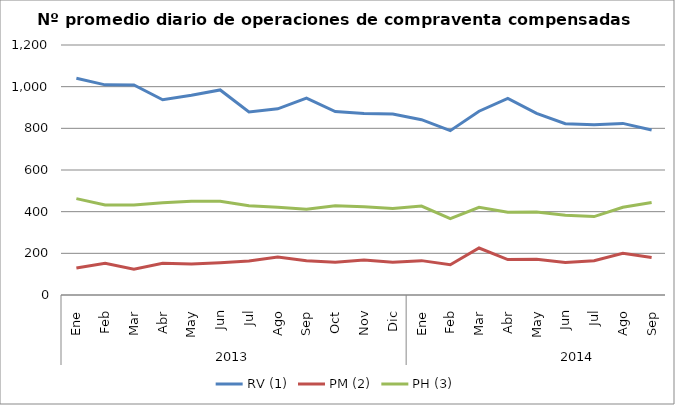
| Category | RV (1) | PM (2) | PH (3) |
|---|---|---|---|
| 0 | 1040.636 | 129.682 | 462.545 |
| 1 | 1008.7 | 152.35 | 432.05 |
| 2 | 1008.45 | 123.6 | 431.9 |
| 3 | 937.091 | 152.273 | 442.545 |
| 4 | 958.381 | 148.429 | 449.571 |
| 5 | 984.3 | 154.95 | 450 |
| 6 | 878.955 | 163.091 | 427.955 |
| 7 | 893.762 | 182.333 | 420.857 |
| 8 | 945.278 | 164.944 | 411.222 |
| 9 | 880.5 | 156.955 | 428.864 |
| 10 | 871.35 | 167.95 | 423.25 |
| 11 | 868.85 | 156.75 | 415.75 |
| 12 | 841.591 | 164.955 | 427.091 |
| 13 | 788.8 | 144.95 | 366.85 |
| 14 | 882.238 | 225.667 | 421.238 |
| 15 | 944 | 170.238 | 397.381 |
| 16 | 871.55 | 171.45 | 398.25 |
| 17 | 822.476 | 155.857 | 382.905 |
| 18 | 816.818 | 164.682 | 376.318 |
| 19 | 823.65 | 200.7 | 421.15 |
| 20 | 791.85 | 180.5 | 444.45 |